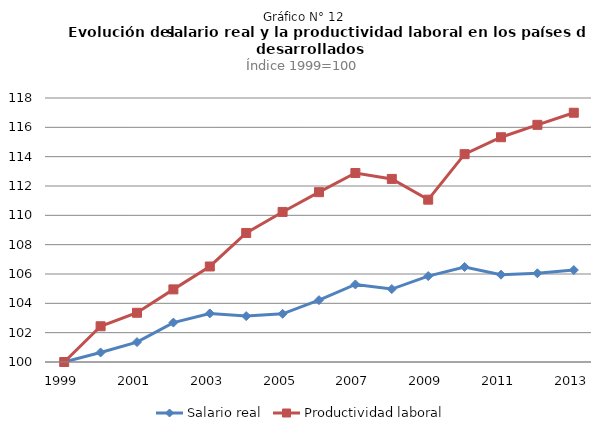
| Category | Salario real | Productividad laboral |
|---|---|---|
| 1999.0 | 100 | 100 |
| 2000.0 | 100.65 | 102.436 |
| 2001.0 | 101.358 | 103.356 |
| 2002.0 | 102.689 | 104.951 |
| 2003.0 | 103.312 | 106.513 |
| 2004.0 | 103.129 | 108.797 |
| 2005.0 | 103.288 | 110.23 |
| 2006.0 | 104.216 | 111.58 |
| 2007.0 | 105.288 | 112.887 |
| 2008.0 | 104.973 | 112.483 |
| 2009.0 | 105.858 | 111.068 |
| 2010.0 | 106.479 | 114.172 |
| 2011.0 | 105.953 | 115.324 |
| 2012.0 | 106.047 | 116.17 |
| 2013.0 | 106.269 | 116.995 |